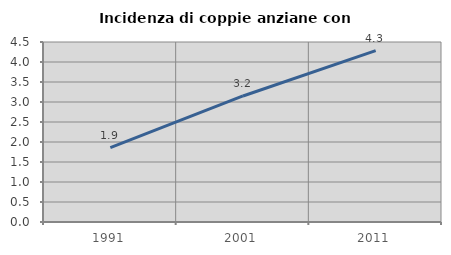
| Category | Incidenza di coppie anziane con figli |
|---|---|
| 1991.0 | 1.86 |
| 2001.0 | 3.151 |
| 2011.0 | 4.284 |